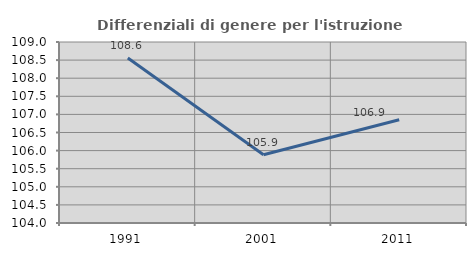
| Category | Differenziali di genere per l'istruzione superiore |
|---|---|
| 1991.0 | 108.557 |
| 2001.0 | 105.885 |
| 2011.0 | 106.852 |